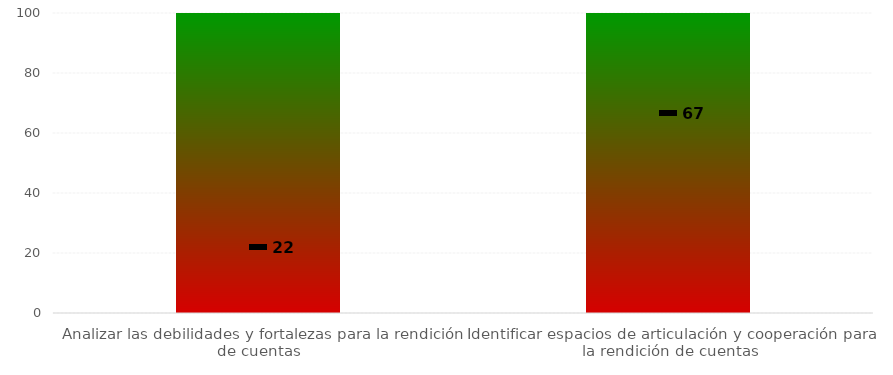
| Category | Niveles |
|---|---|
| Analizar las debilidades y fortalezas para la rendición de cuentas | 100 |
| Identificar espacios de articulación y cooperación para la rendición de cuentas | 100 |